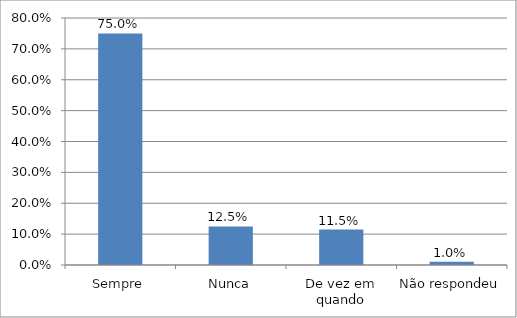
| Category | Series 0 |
|---|---|
| Sempre | 0.75 |
| Nunca | 0.125 |
| De vez em quando | 0.115 |
| Não respondeu | 0.01 |